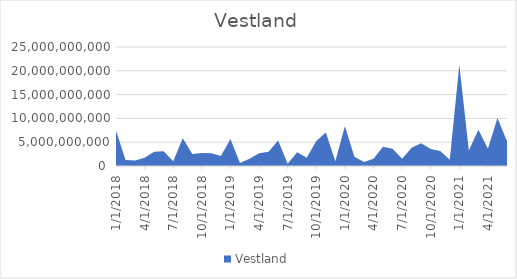
| Category | Vestland |
|---|---|
| 1/1/18 | 7441660000 |
| 2/1/18 | 1239600000 |
| 3/1/18 | 1169050000 |
| 4/1/18 | 1749370000 |
| 5/1/18 | 3013000000 |
| 6/1/18 | 3109250000 |
| 7/1/18 | 982220000 |
| 8/1/18 | 5834160000 |
| 9/1/18 | 2534830000 |
| 10/1/18 | 2717600000 |
| 11/1/18 | 2664890000 |
| 12/1/18 | 2091400000 |
| 1/1/19 | 5657590000 |
| 2/1/19 | 634050000 |
| 3/1/19 | 1518250000 |
| 4/1/19 | 2699350000 |
| 5/1/19 | 3013050000 |
| 6/1/19 | 5358671000 |
| 7/1/19 | 478250000 |
| 8/1/19 | 2892300000 |
| 9/1/19 | 1742000000 |
| 10/1/19 | 5252800000 |
| 11/1/19 | 7028550000 |
| 12/1/19 | 1010250000 |
| 1/1/20 | 8345400000 |
| 2/1/20 | 1923100000 |
| 3/1/20 | 830800000 |
| 4/1/20 | 1515800000 |
| 5/1/20 | 4053950000 |
| 6/1/20 | 3606930000 |
| 7/1/20 | 1508100000 |
| 8/1/20 | 3830700000 |
| 9/1/20 | 4773800000 |
| 10/1/20 | 3592100000 |
| 11/1/20 | 3142110000 |
| 12/1/20 | 1336180000 |
| 1/1/21 | 21273250000 |
| 2/1/21 | 3255550000 |
| 3/1/21 | 7601980000 |
| 4/1/21 | 3615530000 |
| 5/1/21 | 10098850000 |
| 6/1/21 | 5190850000 |